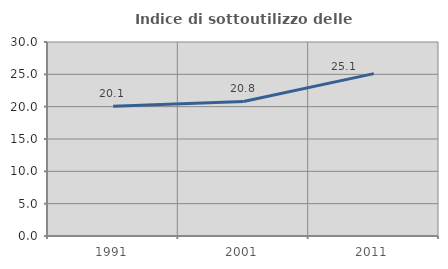
| Category | Indice di sottoutilizzo delle abitazioni  |
|---|---|
| 1991.0 | 20.074 |
| 2001.0 | 20.799 |
| 2011.0 | 25.106 |